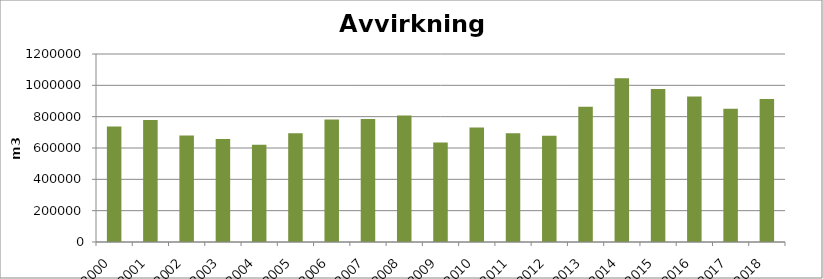
| Category | Totalt |
|---|---|
| 2000 | 737296 |
| 2001 | 778632 |
| 2002 | 680557 |
| 2003 | 658110 |
| 2004 | 620415 |
| 2005 | 694464 |
| 2006 | 781895 |
| 2007 | 785277 |
| 2008 | 807995 |
| 2009 | 635615 |
| 2010 | 731619 |
| 2011 | 694576 |
| 2012 | 678289 |
| 2013 | 863914 |
| 2014 | 1045409 |
| 2015 | 977138 |
| 2016 | 928340 |
| 2017 | 851125 |
| 2018 | 912004 |